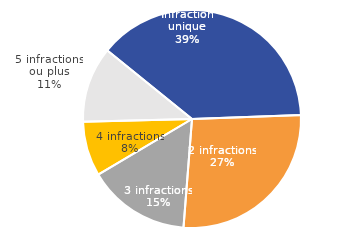
| Category | Series 0 |
|---|---|
| Infraction unique | 38.6 |
| 2 infractions | 26.81 |
| 3 infractions | 15.25 |
| 4 infractions | 8.12 |
| 5 infractions ou plus | 11.22 |